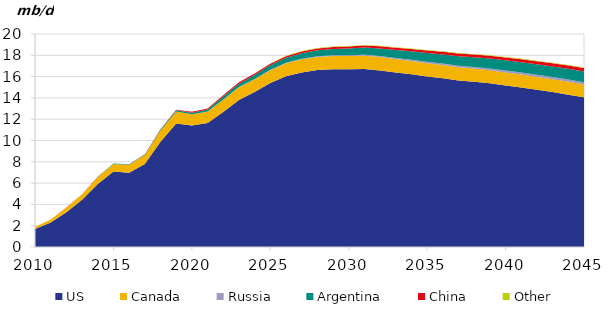
| Category | US | Canada | Russia | Argentina | China | Other |
|---|---|---|---|---|---|---|
| 2010-01-01 | 1.687 | 0.184 | 0.005 | 0.002 | 0.002 | 0 |
| 2011-01-01 | 2.291 | 0.282 | 0.007 | 0.003 | 0.002 | 0 |
| 2012-01-01 | 3.27 | 0.412 | 0.005 | 0.006 | 0.006 | 0 |
| 2013-01-01 | 4.44 | 0.519 | 0.01 | 0.011 | 0.005 | 0 |
| 2014-01-01 | 5.911 | 0.637 | 0.011 | 0.023 | 0.007 | 0 |
| 2015-01-01 | 7.081 | 0.705 | 0.012 | 0.032 | 0.009 | 0 |
| 2016-01-01 | 6.972 | 0.74 | 0.013 | 0.045 | 0.008 | 0 |
| 2017-01-01 | 7.784 | 0.844 | 0.013 | 0.054 | 0.023 | 0 |
| 2018-01-01 | 9.889 | 1.044 | 0.014 | 0.08 | 0.029 | 0 |
| 2019-01-01 | 11.606 | 1.107 | 0.017 | 0.117 | 0.044 | 0 |
| 2020-01-01 | 11.419 | 1.035 | 0.018 | 0.14 | 0.078 | 0 |
| 2021-01-01 | 11.651 | 1.057 | 0.019 | 0.19 | 0.095 | 0 |
| 2022-01-01 | 12.67 | 1.158 | 0.019 | 0.273 | 0.132 | 0 |
| 2023-01-01 | 13.81 | 1.179 | 0.026 | 0.315 | 0.137 | 0 |
| 2024-01-01 | 14.55 | 1.198 | 0.032 | 0.367 | 0.142 | 0.01 |
| 2025-01-01 | 15.396 | 1.211 | 0.039 | 0.419 | 0.148 | 0.02 |
| 2026-01-01 | 16.027 | 1.224 | 0.045 | 0.471 | 0.155 | 0.03 |
| 2027-01-01 | 16.389 | 1.235 | 0.051 | 0.523 | 0.161 | 0.04 |
| 2028-01-01 | 16.61 | 1.241 | 0.058 | 0.565 | 0.168 | 0.05 |
| 2029-01-01 | 16.683 | 1.247 | 0.064 | 0.607 | 0.174 | 0.05 |
| 2030-01-01 | 16.681 | 1.247 | 0.07 | 0.649 | 0.183 | 0.05 |
| 2031-01-01 | 16.718 | 1.249 | 0.081 | 0.686 | 0.192 | 0.05 |
| 2032-01-01 | 16.582 | 1.251 | 0.092 | 0.723 | 0.201 | 0.05 |
| 2033-01-01 | 16.391 | 1.253 | 0.103 | 0.76 | 0.21 | 0.05 |
| 2034-01-01 | 16.222 | 1.248 | 0.114 | 0.797 | 0.219 | 0.05 |
| 2035-01-01 | 16.02 | 1.244 | 0.125 | 0.834 | 0.228 | 0.05 |
| 2036-01-01 | 15.85 | 1.239 | 0.135 | 0.861 | 0.237 | 0.05 |
| 2037-01-01 | 15.644 | 1.235 | 0.146 | 0.888 | 0.246 | 0.05 |
| 2038-01-01 | 15.526 | 1.23 | 0.156 | 0.915 | 0.255 | 0.05 |
| 2039-01-01 | 15.371 | 1.226 | 0.167 | 0.937 | 0.264 | 0.05 |
| 2040-01-01 | 15.172 | 1.222 | 0.177 | 0.955 | 0.273 | 0.05 |
| 2041-01-01 | 14.984 | 1.217 | 0.188 | 0.969 | 0.282 | 0.05 |
| 2042-01-01 | 14.756 | 1.213 | 0.198 | 0.982 | 0.291 | 0.05 |
| 2043-01-01 | 14.547 | 1.209 | 0.209 | 0.992 | 0.3 | 0.05 |
| 2044-01-01 | 14.304 | 1.204 | 0.219 | 1 | 0.309 | 0.05 |
| 2045-01-01 | 14.05 | 1.2 | 0.229 | 1.008 | 0.318 | 0.05 |